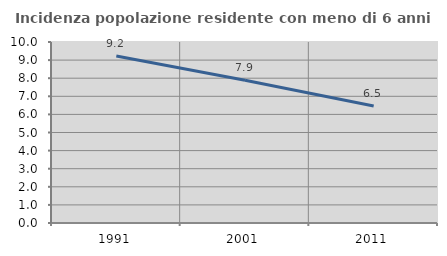
| Category | Incidenza popolazione residente con meno di 6 anni |
|---|---|
| 1991.0 | 9.223 |
| 2001.0 | 7.882 |
| 2011.0 | 6.465 |